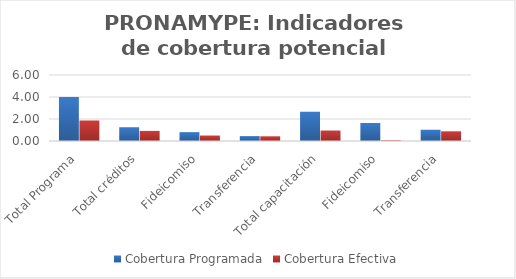
| Category | Cobertura Programada | Cobertura Efectiva |
|---|---|---|
| Total Programa | 4 | 1.864 |
| Total créditos | 1.252 | 0.918 |
| Fideicomiso | 0.806 | 0.491 |
| Transferencia | 0.446 | 0.427 |
| Total capacitación | 2.657 | 0.947 |
| Fideicomiso | 1.638 | 0.065 |
| Transferencia | 1.019 | 0.881 |